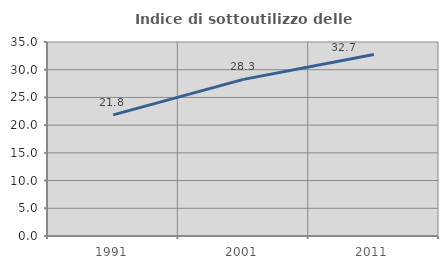
| Category | Indice di sottoutilizzo delle abitazioni  |
|---|---|
| 1991.0 | 21.85 |
| 2001.0 | 28.255 |
| 2011.0 | 32.731 |